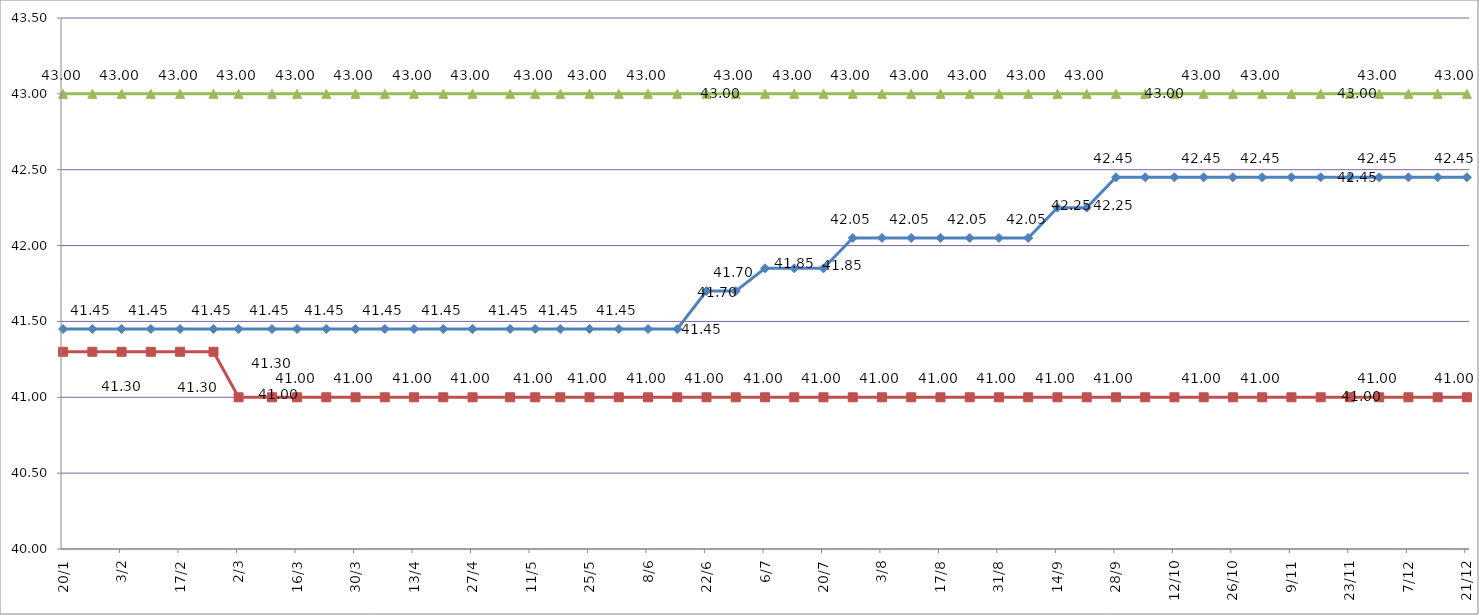
| Category | Кривошеино | Володино | Красный Яр |
|---|---|---|---|
| 2020-01-20 | 41.45 | 41.3 | 43 |
| 2020-01-27 | 41.45 | 41.3 | 43 |
| 2020-02-03 | 41.45 | 41.3 | 43 |
| 2020-02-10 | 41.45 | 41.3 | 43 |
| 2020-02-17 | 41.45 | 41.3 | 43 |
| 2020-02-25 | 41.45 | 41.3 | 43 |
| 2020-03-02 | 41.45 | 41 | 43 |
| 2020-03-10 | 41.45 | 41 | 43 |
| 2020-03-16 | 41.45 | 41 | 43 |
| 2020-03-23 | 41.45 | 41 | 43 |
| 2020-03-30 | 41.45 | 41 | 43 |
| 2020-04-06 | 41.45 | 41 | 43 |
| 2020-04-13 | 41.45 | 41 | 43 |
| 2020-04-20 | 41.45 | 41 | 43 |
| 2020-04-27 | 41.45 | 41 | 43 |
| 2020-05-06 | 41.45 | 41 | 43 |
| 2020-05-12 | 41.45 | 41 | 43 |
| 2020-05-18 | 41.45 | 41 | 43 |
| 2020-05-25 | 41.45 | 41 | 43 |
| 2020-06-01 | 41.45 | 41 | 43 |
| 2020-06-08 | 41.45 | 41 | 43 |
| 2020-06-15 | 41.45 | 41 | 43 |
| 2020-06-22 | 41.7 | 41 | 43 |
| 2020-06-29 | 41.7 | 41 | 43 |
| 2020-07-06 | 41.85 | 41 | 43 |
| 2020-07-13 | 41.85 | 41 | 43 |
| 2020-07-20 | 41.85 | 41 | 43 |
| 2020-07-27 | 42.05 | 41 | 43 |
| 2020-08-03 | 42.05 | 41 | 43 |
| 2020-08-10 | 42.05 | 41 | 43 |
| 2020-08-17 | 42.05 | 41 | 43 |
| 2020-08-24 | 42.05 | 41 | 43 |
| 2020-08-31 | 42.05 | 41 | 43 |
| 2020-09-07 | 42.05 | 41 | 43 |
| 2020-09-14 | 42.25 | 41 | 43 |
| 2020-09-21 | 42.25 | 41 | 43 |
| 2020-09-28 | 42.45 | 41 | 43 |
| 2020-10-05 | 42.45 | 41 | 43 |
| 2020-10-12 | 42.45 | 41 | 43 |
| 2020-10-19 | 42.45 | 41 | 43 |
| 2020-10-26 | 42.45 | 41 | 43 |
| 2020-11-02 | 42.45 | 41 | 43 |
| 2020-11-09 | 42.45 | 41 | 43 |
| 2020-11-16 | 42.45 | 41 | 43 |
| 2020-11-23 | 42.45 | 41 | 43 |
| 2020-11-30 | 42.45 | 41 | 43 |
| 2020-12-07 | 42.45 | 41 | 43 |
| 2020-12-14 | 42.45 | 41 | 43 |
| 2020-12-21 | 42.45 | 41 | 43 |